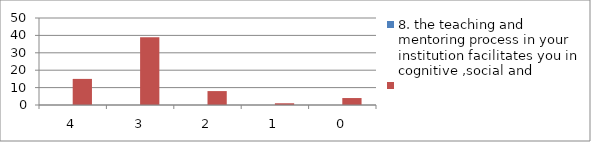
| Category | 8. the teaching and mentoring process in your
institution facilitates you in cognitive ,social and | Series 1 |
|---|---|---|
| 4.0 | 0 | 15 |
| 3.0 | 0 | 39 |
| 2.0 | 0 | 8 |
| 1.0 | 0 | 1 |
| 0.0 | 0 | 4 |